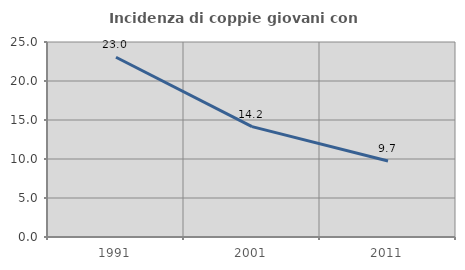
| Category | Incidenza di coppie giovani con figli |
|---|---|
| 1991.0 | 23.049 |
| 2001.0 | 14.156 |
| 2011.0 | 9.739 |